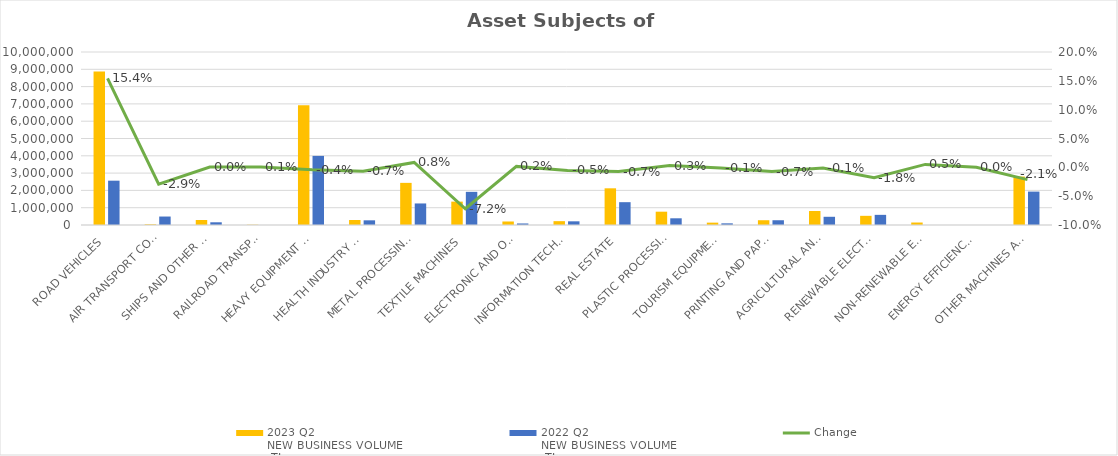
| Category | 2023 Q2 
NEW BUSINESS VOLUME
 TL | 2022 Q2 
NEW BUSINESS VOLUME
 TL |
|---|---|---|
| ROAD VEHICLES | 8869886.67 | 2561742.639 |
| AIR TRANSPORT CONVEYANCE | 38868.879 | 489450 |
| SHIPS AND OTHER SEA-GOING VESSELS | 288872.541 | 157073.45 |
| RAILROAD TRANSPORT VEHICLES | 15840 | 0 |
| HEAVY EQUIPMENT AND CONSTRUCTION MACHINERY | 6922038.203 | 3994553.274 |
| HEALTH INDUSTRY AND AESTHETIC INSTRUMENTS | 288642.842 | 270440.581 |
| METAL PROCESSING MACHINE | 2435248.719 | 1245471.901 |
| TEXTILE MACHINES | 1351659.799 | 1916463.133 |
| ELECTRONIC AND OPTICAL DEVICES | 202923.514 | 88711.345 |
| INFORMATION TECHNOLOGIES AND OFFICE SYSTEMS | 222293.56 | 212769.996 |
| REAL ESTATE | 2120988.169 | 1319346.568 |
| PLASTIC PROCESSING MACHINES | 769887.837 | 387369.645 |
| TOURISM EQUIPMENT | 136014.296 | 95714.34 |
| PRINTING AND PAPER PROCESSING MACHINES | 275821.514 | 275103.573 |
| AGRICULTURAL AND LIVESTOCK FARMING MACHINES | 808381.718 | 474855.981 |
| RENEWABLE ELECTRICITY GENERATION | 530142.575 | 586679.66 |
| NON-RENEWABLE ELECTRIC ENERGY GENERATION | 143388 | 0 |
| ENERGY EFFICIENCY EQUIPMENT | 0 | 0 |
| OTHER MACHINES AND EQUIPMENT | 2801371.744 | 1931053.952 |